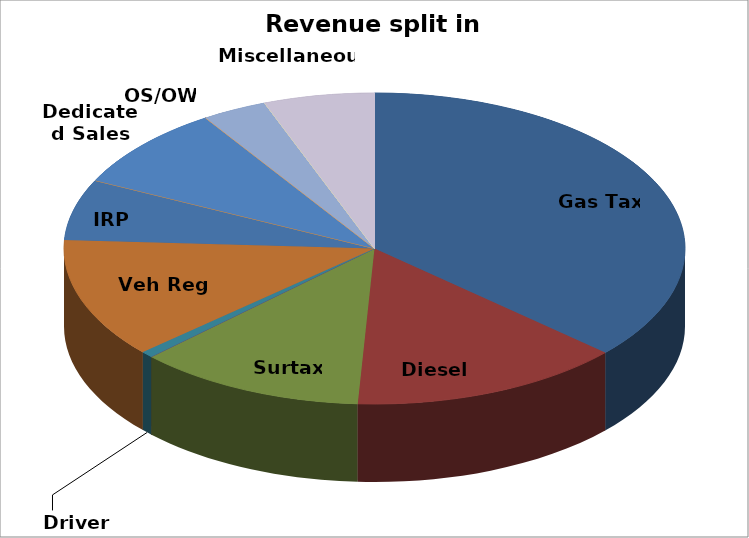
| Category | Series 0 |
|---|---|
| Gas Tax | 301497586.811 |
| Diesel Tax | 116584771.397 |
| Surtax | 97774013.048 |
|  | 0 |
| Driver License | 5285434.597 |
| Veh Reg Fee | 102463995.526 |
| IRP | 52192363.898 |
|  | 0 |
|  | 0 |
|  | 0 |
|  | 0 |
|  | 0 |
| Dedicated Sales Tax | 71048988.877 |
|  | 0 |
|  | 0 |
|  | 0 |
|  | 0 |
|  | 0 |
| OS/OW | 27874604.5 |
|  | 0 |
|  | 0 |
|  | 0 |
|  | 0 |
|  | 0 |
|  | 0 |
|  | 0 |
|  | 0 |
| Miscellaneous | 47323850.509 |